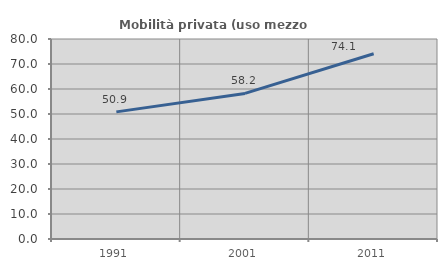
| Category | Mobilità privata (uso mezzo privato) |
|---|---|
| 1991.0 | 50.856 |
| 2001.0 | 58.242 |
| 2011.0 | 74.091 |